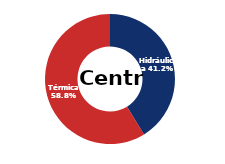
| Category | Centro |
|---|---|
| Eólica | 0 |
| Hidráulica | 1571.406 |
| Solar | 0 |
| Térmica | 2239.822 |